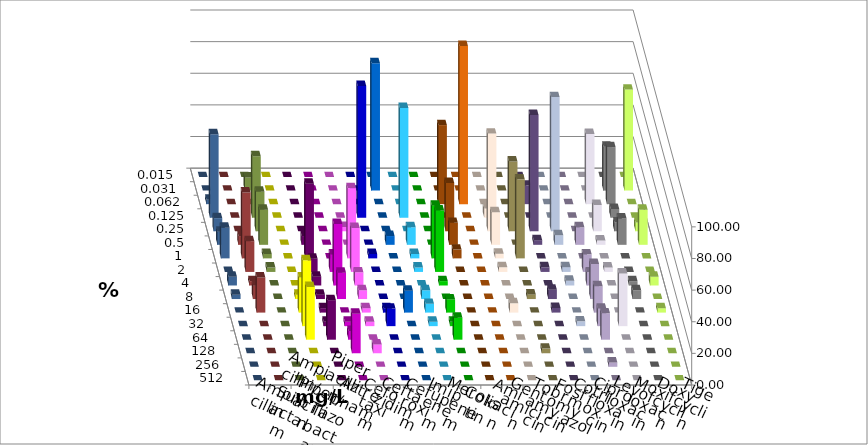
| Category | Ampicillin | Ampicillin/ Sulbactam | Piperacillin | Piperacillin/ Tazobactam | Aztreonam | Cefotaxim | Ceftazidim | Cefuroxim | Imipenem | Meropenem | Colistin | Amikacin | Gentamicin | Tobramycin | Fosfomycin | Cotrimoxazol | Ciprofloxacin | Levofloxacin | Moxifloxacin | Doxycyclin | Tigecyclin |
|---|---|---|---|---|---|---|---|---|---|---|---|---|---|---|---|---|---|---|---|---|---|
| 0.015 | 0 | 0 | 0 | 0 | 0 | 0 | 0 | 0 | 0 | 0 | 0 | 0 | 0 | 0 | 0 | 0 | 0 | 0 | 0 | 0 | 0 |
| 0.031 | 0 | 0 | 0 | 0 | 0 | 80.556 | 0 | 0 | 0 | 0 | 0 | 0 | 0 | 0 | 0 | 0 | 27.778 | 63.889 | 0 | 0 | 8.333 |
| 0.062 | 0 | 0 | 0 | 0 | 0 | 0 | 0 | 0 | 50 | 100 | 0 | 0 | 11.765 | 0 | 0 | 44.444 | 36.111 | 0 | 2.778 | 0 | 0 |
| 0.125 | 0 | 0 | 0 | 0 | 83.333 | 0 | 69.444 | 0 | 0 | 0 | 5.882 | 0 | 0 | 0 | 0 | 0 | 5.556 | 0 | 52.778 | 0 | 38.889 |
| 0.25 | 0 | 0 | 0 | 2.778 | 0 | 0 | 0 | 0 | 30.556 | 0 | 61.765 | 44.118 | 73.529 | 84.848 | 0 | 16.667 | 5.556 | 5.556 | 8.333 | 0 | 25 |
| 0.5 | 0 | 5.556 | 0 | 0 | 0 | 5.556 | 11.111 | 0 | 13.889 | 0 | 20.588 | 0 | 2.941 | 6.061 | 11.111 | 2.778 | 16.667 | 22.222 | 8.333 | 5.556 | 22.222 |
| 1.0 | 0 | 47.222 | 0 | 44.444 | 2.778 | 0 | 2.778 | 33.333 | 5.556 | 0 | 2.941 | 50 | 0 | 0 | 0 | 0 | 0 | 0 | 19.444 | 41.667 | 2.778 |
| 2.0 | 0 | 8.333 | 11.111 | 27.778 | 0 | 0 | 2.778 | 38.889 | 0 | 0 | 2.941 | 0 | 2.941 | 3.03 | 11.111 | 2.778 | 0 | 0 | 0 | 19.444 | 2.778 |
| 4.0 | 0 | 5.556 | 38.889 | 8.333 | 0 | 0 | 0 | 2.778 | 0 | 0 | 0 | 0 | 0 | 3.03 | 8.333 | 0 | 2.778 | 5.556 | 5.556 | 2.778 | 0 |
| 8.0 | 2.778 | 2.778 | 16.667 | 5.556 | 0 | 0 | 5.556 | 0 | 0 | 0 | 0 | 2.941 | 5.882 | 0 | 22.222 | 0 | 5.556 | 0 | 2.778 | 8.333 | 0 |
| 16.0 | 22.222 | 2.778 | 0 | 2.778 | 2.778 | 13.889 | 5.556 | 8.333 | 0 | 0 | 5.882 | 0 | 2.941 | 0 | 16.667 | 0 | 0 | 2.778 | 0 | 22.222 | 0 |
| 32.0 | 41.667 | 2.778 | 2.778 | 2.778 | 11.111 | 0 | 2.778 | 2.778 | 0 | 0 | 0 | 0 | 0 | 3.03 | 11.111 | 33.333 | 0 | 0 | 0 | 0 | 0 |
| 64.0 | 33.333 | 25 | 5.556 | 0 | 0 | 0 | 0 | 13.889 | 0 | 0 | 0 | 0 | 0 | 0 | 16.667 | 0 | 0 | 0 | 0 | 0 | 0 |
| 128.0 | 0 | 0 | 25 | 5.556 | 0 | 0 | 0 | 0 | 0 | 0 | 0 | 2.941 | 0 | 0 | 0 | 0 | 0 | 0 | 0 | 0 | 0 |
| 256.0 | 0 | 0 | 0 | 0 | 0 | 0 | 0 | 0 | 0 | 0 | 0 | 0 | 0 | 0 | 2.778 | 0 | 0 | 0 | 0 | 0 | 0 |
| 512.0 | 0 | 0 | 0 | 0 | 0 | 0 | 0 | 0 | 0 | 0 | 0 | 0 | 0 | 0 | 0 | 0 | 0 | 0 | 0 | 0 | 0 |